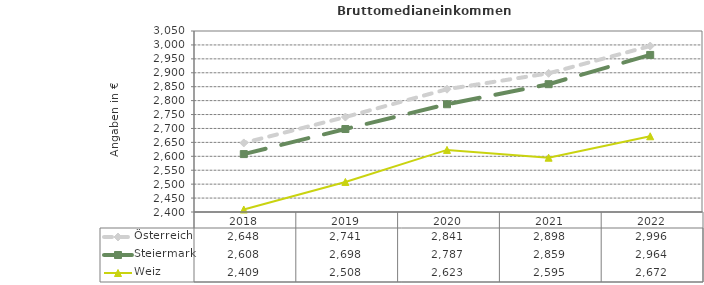
| Category | Österreich | Steiermark | Weiz |
|---|---|---|---|
| 2022.0 | 2996 | 2964 | 2672 |
| 2021.0 | 2898 | 2859 | 2595 |
| 2020.0 | 2841 | 2787 | 2623 |
| 2019.0 | 2741 | 2698 | 2508 |
| 2018.0 | 2648 | 2608 | 2409 |